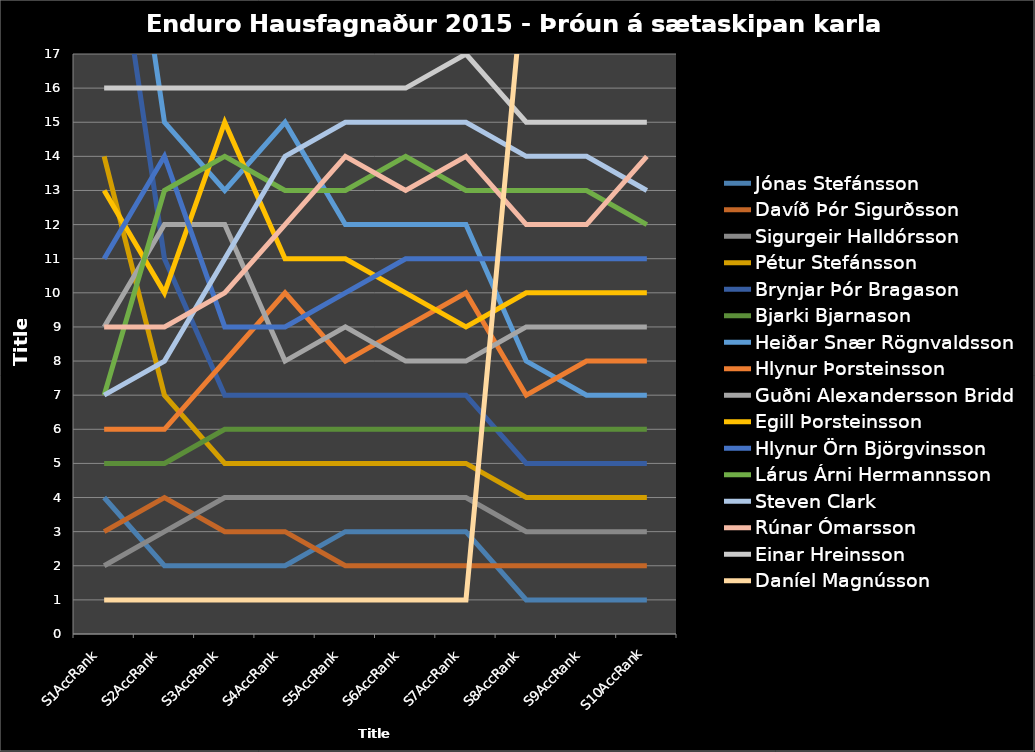
| Category | Jónas Stefánsson  | Davíð Þór Sigurðsson  | Sigurgeir Halldórsson  | Pétur Stefánsson  | Brynjar Þór Bragason  | Bjarki Bjarnason  | Heiðar Snær Rögnvaldsson  | Hlynur Þorsteinsson  | Guðni Alexandersson Bridd | Egill Þorsteinsson  | Hlynur Örn Björgvinsson  | Lárus Árni Hermannsson  | Steven Clark  | Rúnar Ómarsson  | Einar Hreinsson  | Daníel Magnússon  |
|---|---|---|---|---|---|---|---|---|---|---|---|---|---|---|---|---|
| S1AccRank | 4 | 3 | 2 | 14 | 23 | 5 | 27 | 6 | 9 | 13 | 11 | 7 | 7 | 9 | 16 | 1 |
| S2AccRank | 2 | 4 | 3 | 7 | 11 | 5 | 15 | 6 | 12 | 10 | 14 | 13 | 8 | 9 | 16 | 1 |
| S3AccRank | 2 | 3 | 4 | 5 | 7 | 6 | 13 | 8 | 12 | 15 | 9 | 14 | 11 | 10 | 16 | 1 |
| S4AccRank | 2 | 3 | 4 | 5 | 7 | 6 | 15 | 10 | 8 | 11 | 9 | 13 | 14 | 12 | 16 | 1 |
| S5AccRank | 3 | 2 | 4 | 5 | 7 | 6 | 12 | 8 | 9 | 11 | 10 | 13 | 15 | 14 | 16 | 1 |
| S6AccRank | 3 | 2 | 4 | 5 | 7 | 6 | 12 | 9 | 8 | 10 | 11 | 14 | 15 | 13 | 16 | 1 |
| S7AccRank | 3 | 2 | 4 | 5 | 7 | 6 | 12 | 10 | 8 | 9 | 11 | 13 | 15 | 14 | 17 | 1 |
| S8AccRank | 1 | 2 | 3 | 4 | 5 | 6 | 8 | 7 | 9 | 10 | 11 | 13 | 14 | 12 | 15 | 20 |
| S9AccRank | 1 | 2 | 3 | 4 | 5 | 6 | 7 | 8 | 9 | 10 | 11 | 13 | 14 | 12 | 15 | 19 |
| S10AccRank | 1 | 2 | 3 | 4 | 5 | 6 | 7 | 8 | 9 | 10 | 11 | 12 | 13 | 14 | 15 | 19 |